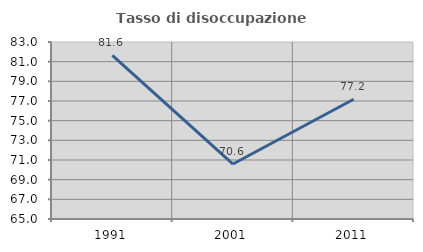
| Category | Tasso di disoccupazione giovanile  |
|---|---|
| 1991.0 | 81.633 |
| 2001.0 | 70.588 |
| 2011.0 | 77.174 |